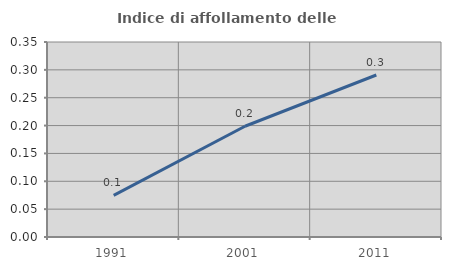
| Category | Indice di affollamento delle abitazioni  |
|---|---|
| 1991.0 | 0.075 |
| 2001.0 | 0.199 |
| 2011.0 | 0.291 |